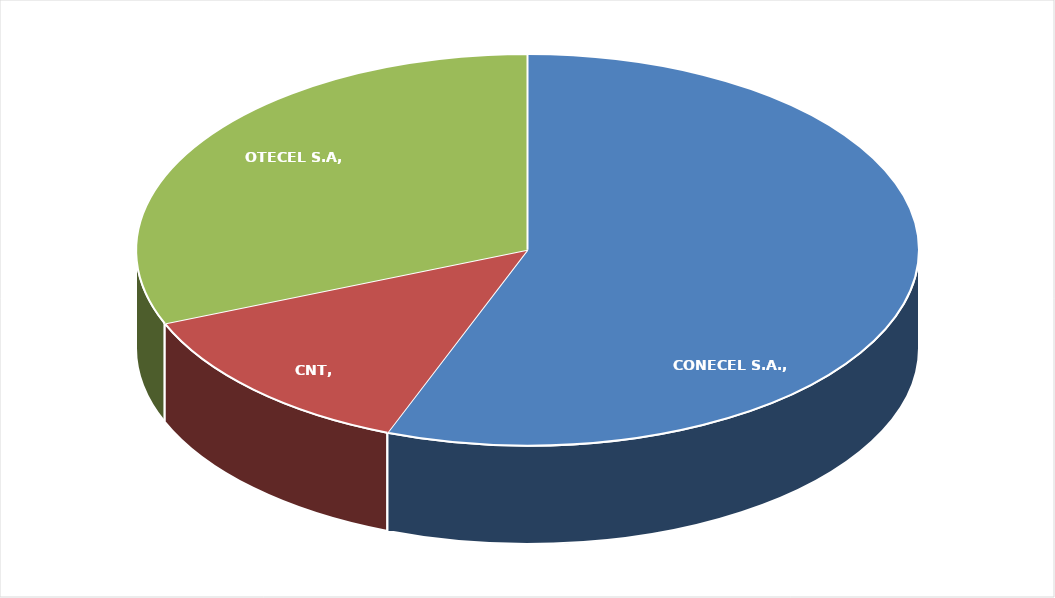
| Category | Series 0 |
|---|---|
| CONECEL S.A. | 0.558 |
| CNT | 0.13 |
| OTECEL S.A | 0.311 |